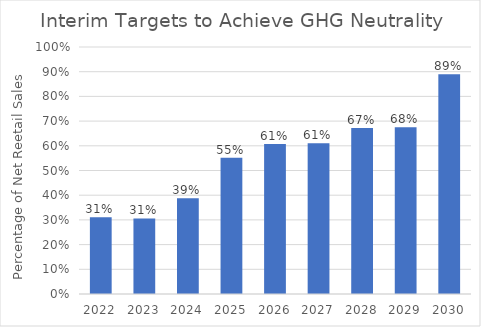
| Category | Percentage Clean Energy |
|---|---|
| 2022.0 | 0.31 |
| 2023.0 | 0.306 |
| 2024.0 | 0.388 |
| 2025.0 | 0.551 |
| 2026.0 | 0.607 |
| 2027.0 | 0.61 |
| 2028.0 | 0.672 |
| 2029.0 | 0.676 |
| 2030.0 | 0.889 |